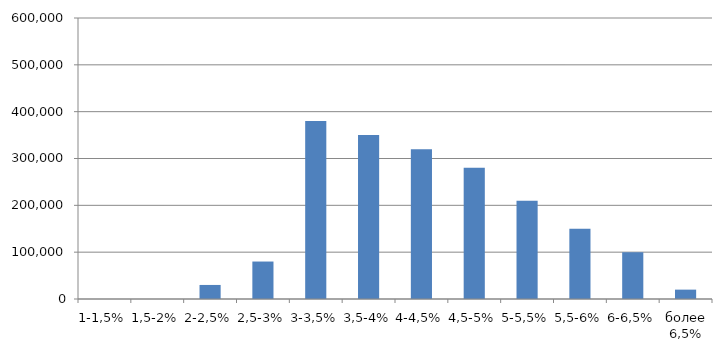
| Category | Выручка, $ |
|---|---|
| 1-1,5% | 0 |
| 1,5-2% | 10 |
| 2-2,5% | 30000 |
| 2,5-3% | 80000 |
| 3-3,5% | 380000 |
| 3,5-4% | 350000 |
| 4-4,5% | 320000 |
| 4,5-5% | 280000 |
| 5-5,5% | 210000 |
| 5,5-6% | 150000 |
| 6-6,5% | 100000 |
| более 6,5% | 20000 |